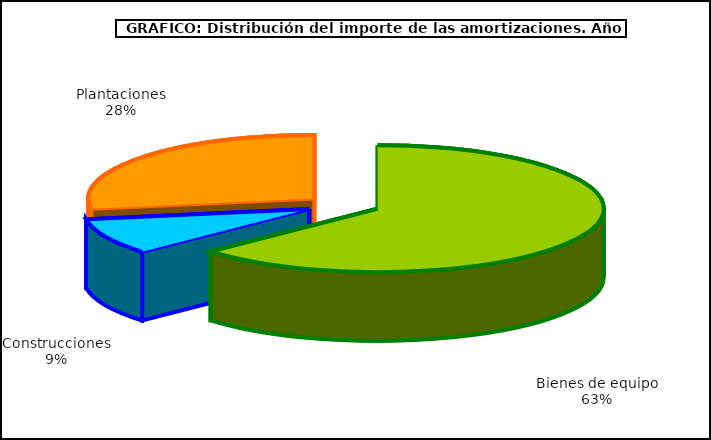
| Category | Series 0 |
|---|---|
| Bienes de equipo | 3284.845 |
| Construcciones | 477.002 |
| Plantaciones | 1433.06 |